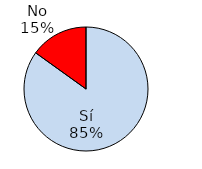
| Category | Series 1 |
|---|---|
| Sí | 574 |
| No | 102 |